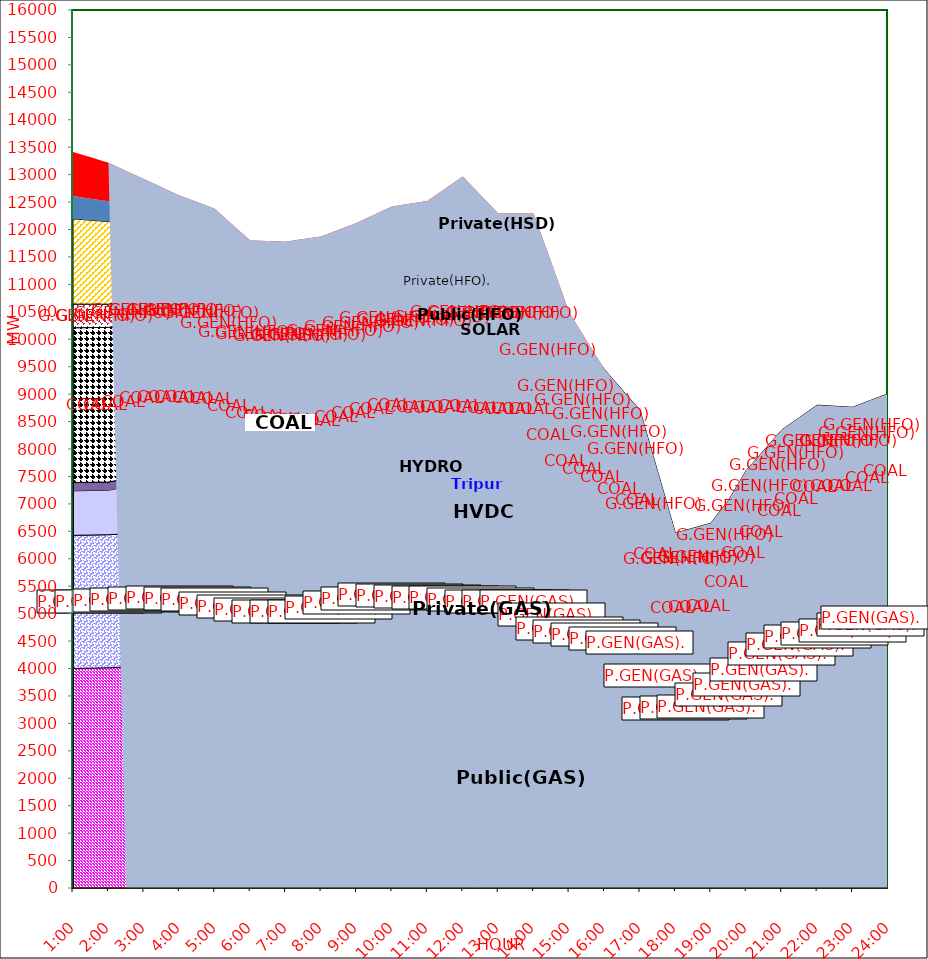
| Category | GAS | P.GEN(GAS). |  HVDC | TRIPURA | HYDRO | COAL | SOLAR | G.GEN(HFO) | P.GEN(HFO). | G.GEN(HSD) | P.GEN(HSD) | SHORTAGE | Total Energy Gen 255.228 MKWHr 
Energy Not Served   7.730 MKWHr 
Energy Requirement     262.957 MKWHr  |
|---|---|---|---|---|---|---|---|---|---|---|---|---|---|
| 1:00 | 4001 | 2426 | 811 | 150 | 0 | 2821 | 0 | 432 | 1553 | 0 | 415 | 803.155 |  |
| 1:30 | 4007 | 2425.5 | 811 | 149 | 0 | 2820 | 0 | 427.5 | 1529.5 | 0 | 391.5 | 753.495 |  |
| 2:00 | 4013 | 2425 | 811 | 148 | 0 | 2819 | 0 | 423 | 1506 | 0 | 368 | 703.835 |  |
| 2:30 | 4027.5 | 2426.5 | 858.5 | 148 | 0 | 2817.5 | 0 | 418 | 1414.5 | 0 | 270 | 687.122 |  |
| 3:00 | 4042 | 2428 | 906 | 148 | 0 | 2816 | 0 | 413 | 1323 | 0 | 172 | 670.41 |  |
| 3:30 | 4061.5 | 2421.5 | 906.5 | 150 | 0 | 2817.5 | 0 | 376 | 1304.5 | 0 | 86 | 646.057 |  |
| 4:00 | 4081 | 2415 | 907 | 152 | 0 | 2819 | 0 | 339 | 1286 | 0 | 0 | 621.705 |  |
| 4:30 | 4074.5 | 2400.5 | 906.5 | 148 | 0 | 2822 | 0 | 327.5 | 1267 | 0 | 0 | 552.945 |  |
| 5:00 | 4068 | 2386 | 906 | 144 | 0 | 2825 | 0 | 316 | 1248 | 0 | 0 | 484.185 |  |
| 5:30 | 4009 | 2364 | 906 | 146 | 0 | 2734 | 9.5 | 288.5 | 1181.5 | 0 | 0 | 450.283 |  |
| 6:00 | 3950 | 2342 | 906 | 148 | 0 | 2643 | 19 | 261 | 1115 | 0 | 0 | 416.38 |  |
| 6:30 | 3913 | 2334.5 | 907 | 143 | 0 | 2631.5 | 47.5 | 253 | 1112 | 0 | 0 | 447.418 |  |
| 7:00 | 3876 | 2327 | 908 | 138 | 0 | 2620 | 76 | 245 | 1109 | 0 | 0 | 478.455 |  |
| 7:30 | 3871 | 2331 | 907 | 136 | 0 | 2591 | 123.5 | 241.5 | 1105.5 | 0 | 0 | 519.043 |  |
| 8:00 | 3866 | 2335 | 906 | 134 | 0 | 2562 | 171 | 238 | 1102 | 0 | 0 | 559.63 |  |
| 8:30 | 3936.5 | 2358.5 | 906.5 | 137 | 0 | 2511 | 190.5 | 237.5 | 1089 | 0 | 0 | 628.868 |  |
| 9:00 | 4007 | 2382 | 907 | 140 | 0 | 2460 | 210 | 237 | 1076 | 0 | 0 | 698.105 |  |
| 9:30 | 4089 | 2373.5 | 906.5 | 143 | 12.5 | 2420.5 | 247 | 236 | 1166 | 0 | 0 | 674.23 |  |
| 10:00 | 4171 | 2365 | 906 | 146 | 25 | 2381 | 284 | 235 | 1256 | 0 | 0 | 650.355 |  |
| 10:30 | 4148 | 2368 | 906.5 | 147 | 25 | 2370.5 | 272 | 254.5 | 1255.5 | 0 | 53 | 668.5 |  |
| 11:00 | 4125 | 2371 | 907 | 148 | 25 | 2360 | 260 | 274 | 1255 | 0 | 106 | 686.645 |  |
| 11:30 | 4115.5 | 2370.5 | 907 | 156 | 25 | 2395.5 | 317 | 269.5 | 1311 | 0 | 159 | 715.295 |  |
| 12:00 | 4106 | 2370 | 907 | 164 | 25 | 2431 | 374 | 265 | 1367 | 0 | 212 | 743.945 |  |
| 12:30 | 4077.5 | 2364.5 | 906.5 | 163 | 25 | 2446.5 | 377 | 271 | 1371.5 | 0 | 161 | 465.085 |  |
| 13:00 | 4049 | 2359 | 906 | 162 | 25 | 2462 | 380 | 277 | 1376 | 0 | 110 | 186.225 |  |
| 13:30 | 4049 | 2359 | 906 | 162 | 25 | 2462 | 380 | 277 | 1376 | 0 | 110 | 186.225 |  |
| 14:00 | 4049 | 2359 | 906 | 162 | 25 | 2462 | 380 | 277 | 1376 | 0 | 110 | 186.225 |  |
| 14:30 | 3907.5 | 2142.5 | 906.5 | 118 | 25 | 2329.5 | 251.5 | 271 | 1211.5 | 0 | 55 | 174.287 |  |
| 15:00 | 3766 | 1926 | 907 | 74 | 25 | 2197 | 123 | 265 | 1047 | 0 | 0 | 162.35 |  |
| 15:30 | 3743.5 | 1855 | 907 | 77 | 25 | 2081.5 | 96.5 | 220 | 883 | 0 | 0 | 81.175 |  |
| 16:00 | 3721 | 1784 | 907 | 80 | 25 | 1966 | 70 | 175 | 719 | 0 | 0 | 0 |  |
| 16:30 | 3685 | 1724.5 | 856 | 88 | 25 | 1814.5 | 44 | 171 | 669 | 0 | 0 | 0 |  |
| 17:00 | 3649 | 1665 | 805 | 96 | 25 | 1663 | 18 | 167 | 619 | 0 | 0 | 0 |  |
| 17:30 | 3174.5 | 1402.5 | 553 | 104 | 25 | 1657.5 | 10 | 153.5 | 507 | 0 | 0 | 0 |  |
| 18:00 | 2700 | 1140 | 301 | 112 | 25 | 1652 | 2 | 140 | 395 | 0 | 0 | 0 |  |
| 18:30 | 2721.5 | 1132 | 326 | 103 | 25 | 1642 | 1 | 135 | 471.5 | 0 | 0 | 0 |  |
| 19:00 | 2743 | 1124 | 351 | 94 | 25 | 1632 | 0 | 130 | 548 | 0 | 0 | 0 |  |
| 19:30 | 2933 | 1173 | 546 | 100 | 25 | 1634 | 0 | 68 | 587 | 0 | 0 | 0 |  |
| 20:00 | 3085 | 1235 | 825 | 108 | 25 | 1657 | 0 | 68 | 605 | 0 | 0 | 0 |  |
| 20:30 | 3277 | 1424 | 829.5 | 116 | 25 | 1636.5 | 0 | 68 | 601 | 0 | 0 | 0 |  |
| 21:00 | 3469 | 1613 | 834 | 124 | 25 | 1616 | 0 | 68 | 597 | 0 | 0 | 0 |  |
| 21:30 | 3545 | 1767.5 | 816.5 | 130 | 25 | 1615 | 0 | 68 | 605.5 | 0 | 0 | 0 |  |
| 22:00 | 3621 | 1922 | 799 | 136 | 25 | 1614 | 0 | 68 | 614 | 0 | 0 | 0 |  |
| 22:30 | 3702 | 1874 | 799 | 128 | 12.5 | 1620.5 | 0 | 42.5 | 601 | 0 | 0 | 0 |  |
| 23:00 | 3783 | 1826 | 799 | 120 | 0 | 1627 | 0 | 17 | 588 | 0 | 0 | 0 |  |
| 23:30 | 3875.5 | 1868.5 | 799 | 116 | 0 | 1634 | 0 | 17 | 573 | 0 | 0 | 0 |  |
| 24:00 | 3968 | 1911 | 799 | 112 | 0 | 1641 | 0 | 17 | 558 | 0 | 0 | 0 |  |